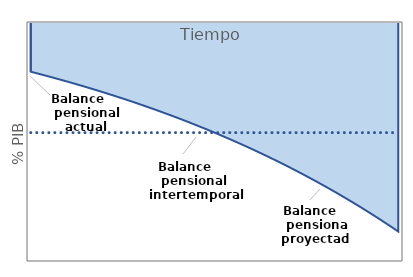
| Category | Intertemporal pension balance |
|---|---|
| 1.0 | -1.157 |
| 1.0 | -1.157 |
| 2.0 | -1.157 |
| 3.0 | -1.157 |
| 4.0 | -1.157 |
| 5.0 | -1.157 |
| 6.0 | -1.157 |
| 7.0 | -1.157 |
| 8.0 | -1.157 |
| 9.0 | -1.157 |
| 10.0 | -1.157 |
| 11.0 | -1.157 |
| 12.0 | -1.157 |
| 13.0 | -1.157 |
| 14.0 | -1.157 |
| 15.0 | -1.157 |
| 16.0 | -1.157 |
| 17.0 | -1.157 |
| 18.0 | -1.157 |
| 19.0 | -1.157 |
| 20.0 | -1.157 |
| 21.0 | -1.157 |
| 22.0 | -1.157 |
| 23.0 | -1.157 |
| 24.0 | -1.157 |
| 25.0 | -1.157 |
| 26.0 | -1.157 |
| 27.0 | -1.157 |
| 28.0 | -1.157 |
| 29.0 | -1.157 |
| 30.0 | -1.157 |
| 31.0 | -1.157 |
| 32.0 | -1.157 |
| 33.0 | -1.157 |
| 34.0 | -1.157 |
| 35.0 | -1.157 |
| 36.0 | -1.157 |
| 37.0 | -1.157 |
| 38.0 | -1.157 |
| 39.0 | -1.157 |
| 40.0 | -1.157 |
| 41.0 | -1.157 |
| 42.0 | -1.157 |
| 43.0 | -1.157 |
| 44.0 | -1.157 |
| 45.0 | -1.157 |
| 46.0 | -1.157 |
| 47.0 | -1.157 |
| 48.0 | -1.157 |
| 49.0 | -1.157 |
| 50.0 | -1.157 |